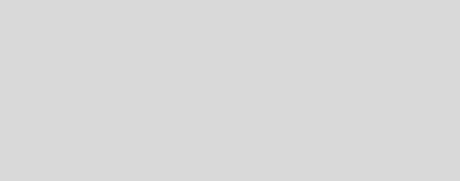
| Category | Series 0 | Series 1 | Series 2 |
|---|---|---|---|
| U/W Philosophy | 0 | 0 | 0 |
| Collecting Information | 0 | 0 | 0 |
| Validating Information | 0 | 0 | 0 |
| Claims Philosophy | 0 | 0 | 0 |
| Alignment of U/W & Claims Philosophy | 0 | 0 | 0 |
| Product Mitigants | 0 | 0 | 0 |